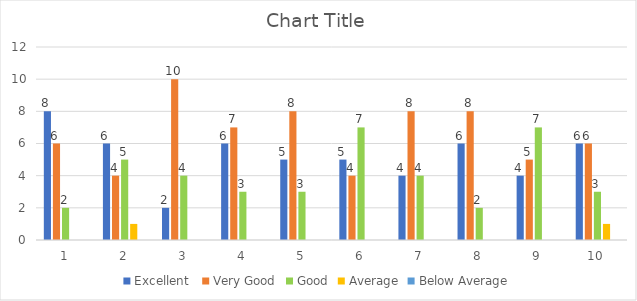
| Category | Excellent  | Very Good | Good | Average | Below Average |
|---|---|---|---|---|---|
| 0 | 8 | 6 | 2 | 0 | 0 |
| 1 | 6 | 4 | 5 | 1 | 0 |
| 2 | 2 | 10 | 4 | 0 | 0 |
| 3 | 6 | 7 | 3 | 0 | 0 |
| 4 | 5 | 8 | 3 | 0 | 0 |
| 5 | 5 | 4 | 7 | 0 | 0 |
| 6 | 4 | 8 | 4 | 0 | 0 |
| 7 | 6 | 8 | 2 | 0 | 0 |
| 8 | 4 | 5 | 7 | 0 | 0 |
| 9 | 6 | 6 | 3 | 1 | 0 |